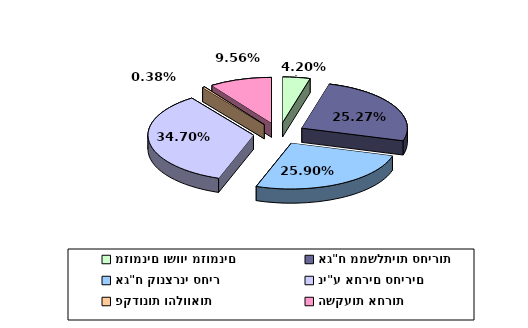
| Category | Series 0 |
|---|---|
| מזומנים ושווי מזומנים | 0.042 |
| אג"ח ממשלתיות סחירות | 0.253 |
| אג"ח קונצרני סחיר | 0.259 |
| ני"ע אחרים סחירים | 0.347 |
| פקדונות והלוואות | 0.004 |
| השקעות אחרות | 0.096 |